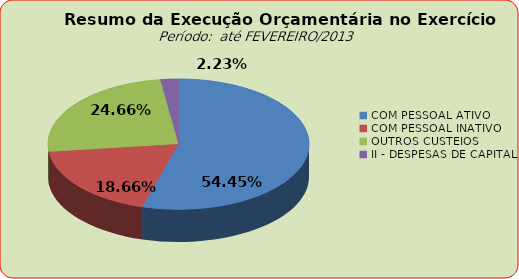
| Category | Series 0 |
|---|---|
| COM PESSOAL ATIVO | 16964914.91 |
| COM PESSOAL INATIVO | 5814828.7 |
| OUTROS CUSTEIOS | 7682351.88 |
| II - DESPESAS DE CAPITAL | 693766.72 |